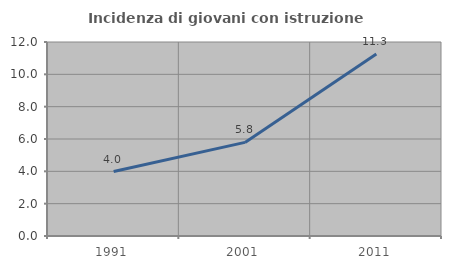
| Category | Incidenza di giovani con istruzione universitaria |
|---|---|
| 1991.0 | 3.988 |
| 2001.0 | 5.789 |
| 2011.0 | 11.254 |